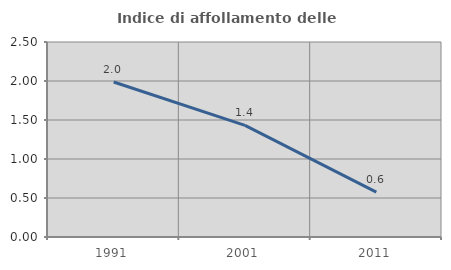
| Category | Indice di affollamento delle abitazioni  |
|---|---|
| 1991.0 | 1.988 |
| 2001.0 | 1.431 |
| 2011.0 | 0.575 |